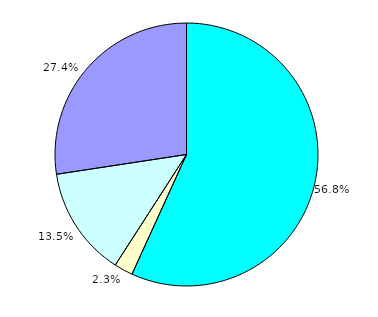
| Category | 74 981 3 043 17 805 |
|---|---|
| 0 | 74981 |
| 1 | 3043 |
| 2 | 17805 |
| 3 | 36176 |